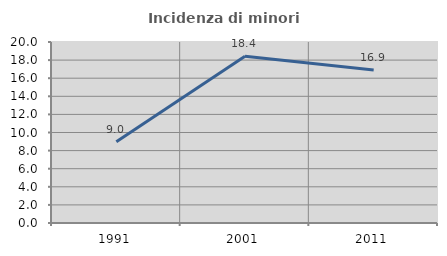
| Category | Incidenza di minori stranieri |
|---|---|
| 1991.0 | 8.974 |
| 2001.0 | 18.436 |
| 2011.0 | 16.901 |